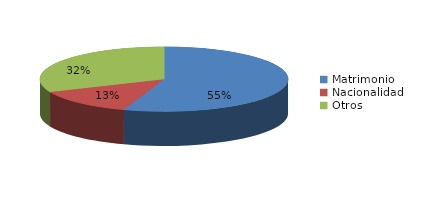
| Category | Series 0 |
|---|---|
| Matrimonio | 702 |
| Nacionalidad | 168 |
| Otros | 401 |